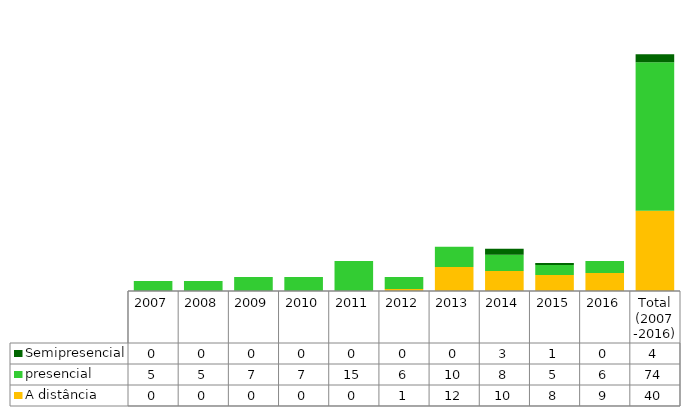
| Category | A distância | presencial | Semipresencial |
|---|---|---|---|
| 2007 | 0 | 5 | 0 |
| 2008 | 0 | 5 | 0 |
| 2009 | 0 | 7 | 0 |
| 2010 | 0 | 7 | 0 |
| 2011 | 0 | 15 | 0 |
| 2012 | 1 | 6 | 0 |
| 2013 | 12 | 10 | 0 |
| 2014 | 10 | 8 | 3 |
| 2015 | 8 | 5 | 1 |
| 2016 | 9 | 6 | 0 |
| Total (2007 -2016) | 40 | 74 | 4 |